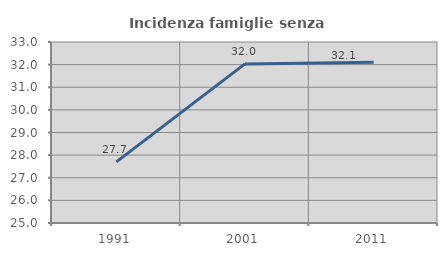
| Category | Incidenza famiglie senza nuclei |
|---|---|
| 1991.0 | 27.701 |
| 2001.0 | 32.031 |
| 2011.0 | 32.102 |